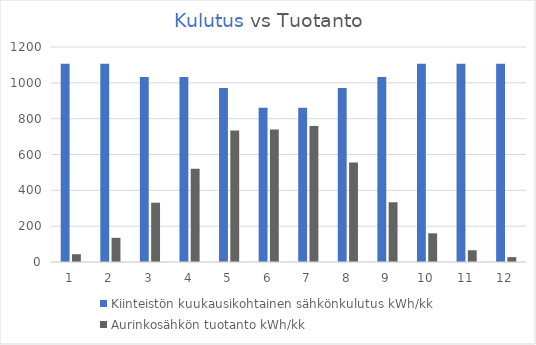
| Category | Kiinteistön kuukausikohtainen sähkönkulutus kWh/kk | Aurinkosähkön tuotanto kWh/kk |
|---|---|---|
| 0 | 1107 | 43.408 |
| 1 | 1107 | 134.775 |
| 2 | 1033.2 | 330.986 |
| 3 | 1033.2 | 519.845 |
| 4 | 971.7 | 733.865 |
| 5 | 861 | 739.073 |
| 6 | 861 | 759.639 |
| 7 | 971.7 | 554.808 |
| 8 | 1033.2 | 333.436 |
| 9 | 1107 | 160.067 |
| 10 | 1107 | 65.637 |
| 11 | 1107 | 27.13 |